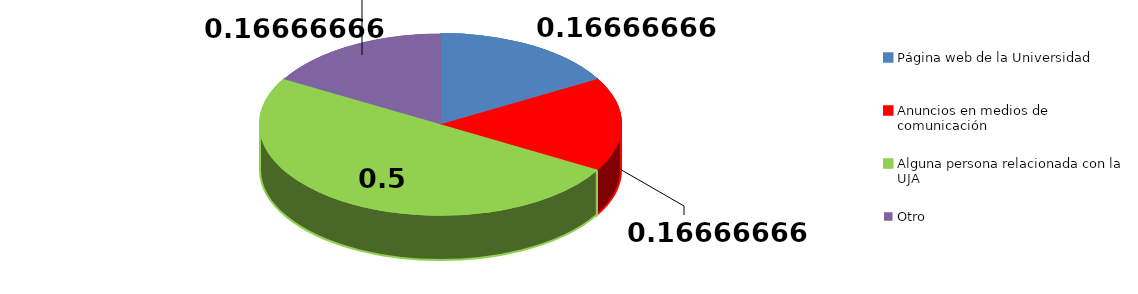
| Category | Frecuencia | Series 1 |
|---|---|---|
| Página web de la Universidad | 1 |  |
| Anuncios en medios de comunicación | 1 |  |
| Alguna persona relacionada con la UJA | 3 |  |
| Otro | 1 |  |